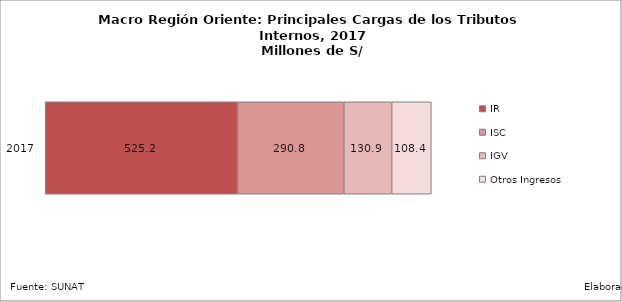
| Category | IR | ISC | IGV | Otros Ingresos |
|---|---|---|---|---|
| 2017.0 | 525.22 | 290.812 | 130.896 | 108.408 |